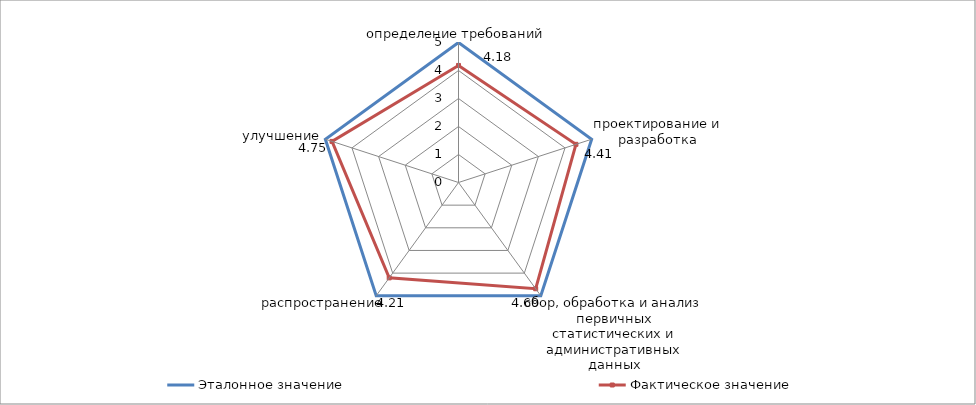
| Category | Эталонное значение | Фактическое значение |
|---|---|---|
| определение требований | 5 | 4.18 |
| проектирование и разработка | 5 | 4.41 |
| сбор, обработка и анализ первичных статистических и административных данных | 5 | 4.69 |
| распространение | 5 | 4.21 |
| улучшение | 5 | 4.75 |